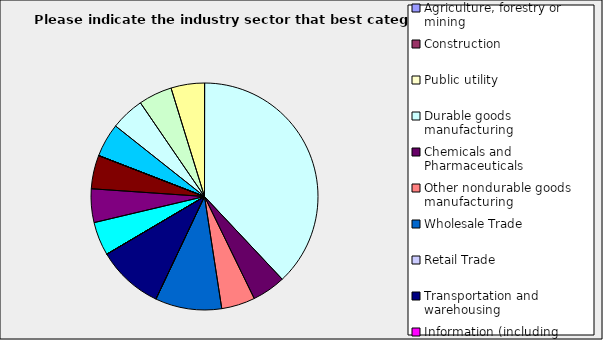
| Category | Series 0 |
|---|---|
| Agriculture, forestry or mining | 0 |
| Construction | 0 |
| Public utility | 0 |
| Durable goods manufacturing | 0.381 |
| Chemicals and Pharmaceuticals | 0.048 |
| Other nondurable goods manufacturing | 0.048 |
| Wholesale Trade | 0.095 |
| Retail Trade | 0 |
| Transportation and warehousing | 0.095 |
| Information (including broadcasting and telecommunication) | 0 |
| Finance and Insurance | 0 |
| Real Estate | 0.048 |
| Professional, scientific and technical services | 0.048 |
| Consulting | 0.048 |
| Administrative and office services (including waste management) | 0 |
| Education | 0 |
| Health Care and social services | 0.048 |
| Arts, entertainment and recreation | 0.048 |
| Accommodation and food services | 0.048 |
| Other | 0.048 |